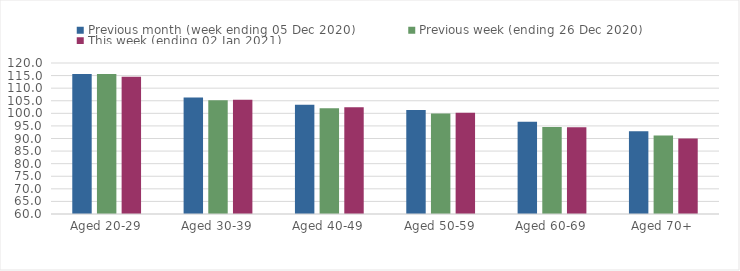
| Category | Previous month (week ending 05 Dec 2020) | Previous week (ending 26 Dec 2020) | This week (ending 02 Jan 2021) |
|---|---|---|---|
| Aged 20-29 | 115.64 | 115.64 | 114.58 |
| Aged 30-39 | 106.25 | 105.2 | 105.39 |
| Aged 40-49 | 103.44 | 102.06 | 102.45 |
| Aged 50-59 | 101.36 | 99.95 | 100.28 |
| Aged 60-69 | 96.64 | 94.58 | 94.48 |
| Aged 70+ | 92.85 | 91.19 | 90.04 |